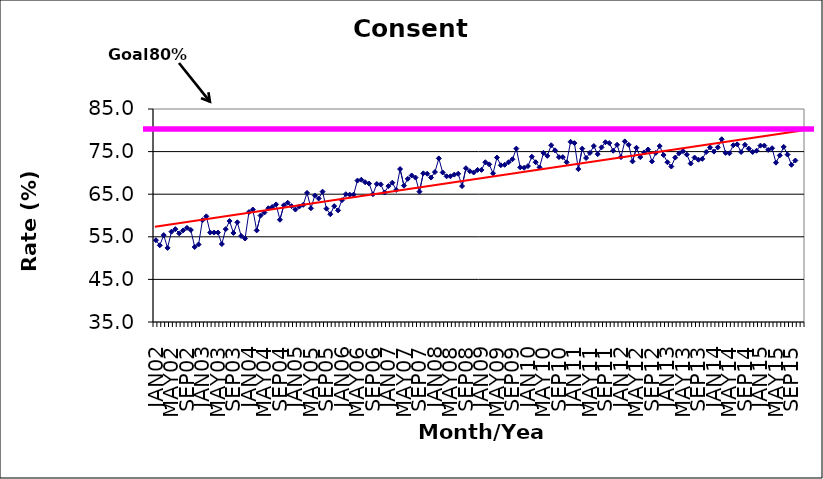
| Category | Series 0 |
|---|---|
| JAN02 | 54.2 |
| FEB02 | 53 |
| MAR02 | 55.4 |
| APR02 | 52.4 |
| MAY02 | 56.2 |
| JUN02 | 56.8 |
| JUL02 | 55.8 |
| AUG02 | 56.5 |
| SEP02 | 57.1 |
| OCT02 | 56.6 |
| NOV02 | 52.6 |
| DEC02 | 53.2 |
| JAN03 | 58.9 |
| FEB03 | 59.8 |
| MAR03 | 56 |
| APR03 | 56 |
| MAY03 | 56 |
| JUN03 | 53.3 |
| JUL03 | 56.8 |
| AUG03 | 58.7 |
| SEP03 | 55.9 |
| OCT03 | 58.4 |
| NOV03 | 55.2 |
| DEC03 | 54.6 |
| JAN04 | 60.8 |
| FEB04 | 61.4 |
| MAR04 | 56.5 |
| APR04 | 60 |
| MAY04 | 60.7 |
| JUN04 | 61.7 |
| JUL04 | 62 |
| AUG04 | 62.6 |
| SEP04 | 59 |
| OCT04 | 62.4 |
| NOV04 | 63 |
| DEC04 | 62.2 |
| JAN05 | 61.4 |
| FEB05 | 62.1 |
| MAR05 | 62.5 |
| APR05 | 65.3 |
| MAY05 | 61.7 |
| JUN05 | 64.7 |
| JUL05 | 64 |
| AUG05 | 65.6 |
| SEP05 | 61.6 |
| OCT05 | 60.3 |
| NOV05 | 62.2 |
| DEC05 | 61.2 |
| JAN06 | 63.6 |
| FEB06 | 65 |
| MAR06 | 64.9 |
| APR06 | 64.9 |
| MAY06 | 68.2 |
| JUN06 | 68.4 |
| JUL06 | 67.8 |
| AUG06 | 67.5 |
| SEP06 | 65 |
| OCT06 | 67.4 |
| NOV06 | 67.3 |
| DEC06 | 65.4 |
| JAN07 | 66.9 |
| FEB07 | 67.7 |
| MAR07 | 66 |
| APR07 | 70.9 |
| MAY07 | 67 |
| JUN07 | 68.6 |
| JUL07 | 69.4 |
| AUG07 | 68.9 |
| SEP07 | 65.6 |
| OCT07 | 69.9 |
| NOV07 | 69.8 |
| DEC07 | 68.9 |
| JAN08 | 70.2 |
| FEB08 | 73.4 |
| MAR08 | 70.1 |
| APR08 | 69.2 |
| MAY08 | 69.2 |
| JUN08 | 69.6 |
| JUL08 | 69.8 |
| AUG08 | 66.9 |
| SEP08 | 71.1 |
| OCT08 | 70.4 |
| NOV08 | 70.1 |
| DEC08 | 70.7 |
| JAN09 | 70.7 |
| FEB09 | 72.5 |
| MAR09 | 72 |
| APR09 | 69.9 |
| MAY09 | 73.6 |
| JUN09 | 71.8 |
| JUL09 | 71.9 |
| AUG09 | 72.5 |
| SEP09 | 73.2 |
| OCT09 | 75.7 |
| NOV09 | 71.3 |
| DEC09 | 71.2 |
| JAN10 | 71.6 |
| FEB10 | 73.8 |
| MAR10 | 72.5 |
| APR10 | 71.3 |
| MAY10 | 74.7 |
| JUN10 | 74 |
| JUL10 | 76.5 |
| AUG10 | 75.3 |
| SEP10 | 73.7 |
| OCT10 | 73.7 |
| NOV10 | 72.5 |
| DEC10 | 77.3 |
| JAN11 | 77 |
| FEB11 | 70.9 |
| MAR11 | 75.7 |
| APR11 | 73.5 |
| MAY11 | 74.7 |
| JUN11 | 76.3 |
| JUL11 | 74.4 |
| AUG11 | 76 |
| SEP11 | 77.2 |
| OCT11 | 77 |
| NOV11 | 75.2 |
| DEC11 | 76.6 |
| JAN12 | 73.7 |
| FEB12 | 77.4 |
| MAR12 | 76.6 |
| APR12 | 72.7 |
| MAY12 | 75.9 |
| JUN12 | 73.7 |
| JUL12 | 74.8 |
| AUG12 | 75.5 |
| SEP12 | 72.7 |
| OCT12 | 74.7 |
| NOV12 | 76.3 |
| DEC12 | 74.2 |
| JAN13 | 72.5 |
| FEB13 | 71.5 |
| MAR13 | 73.6 |
| APR13 | 74.6 |
| MAY13 | 75.1 |
| JUN13 | 74.3 |
| JUL13 | 72.2 |
| AUG13 | 73.6 |
| SEP13 | 73.1 |
| OCT13 | 73.3 |
| NOV13 | 74.9 |
| DEC13 | 76 |
| JAN14 | 75 |
| FEB14 | 76 |
| MAR14 | 77.9 |
| APR14 | 74.7 |
| MAY14 | 74.6 |
| JUN14 | 76.5 |
| JUL14 | 76.7 |
| AUG14 | 74.9 |
| SEP14 | 76.6 |
| OCT14 | 75.7 |
| NOV14 | 74.9 |
| DEC14 | 75.2 |
| JAN15 | 76.4 |
| FEB15 | 76.4 |
| MAR15 | 75.4 |
| APR15 | 75.8 |
| MAY15 | 72.4 |
| JUN15 | 74.1 |
| JUL15 | 76.1 |
| AUG15 | 74.3 |
| SEP15 | 71.9 |
| OCT15 | 72.9 |